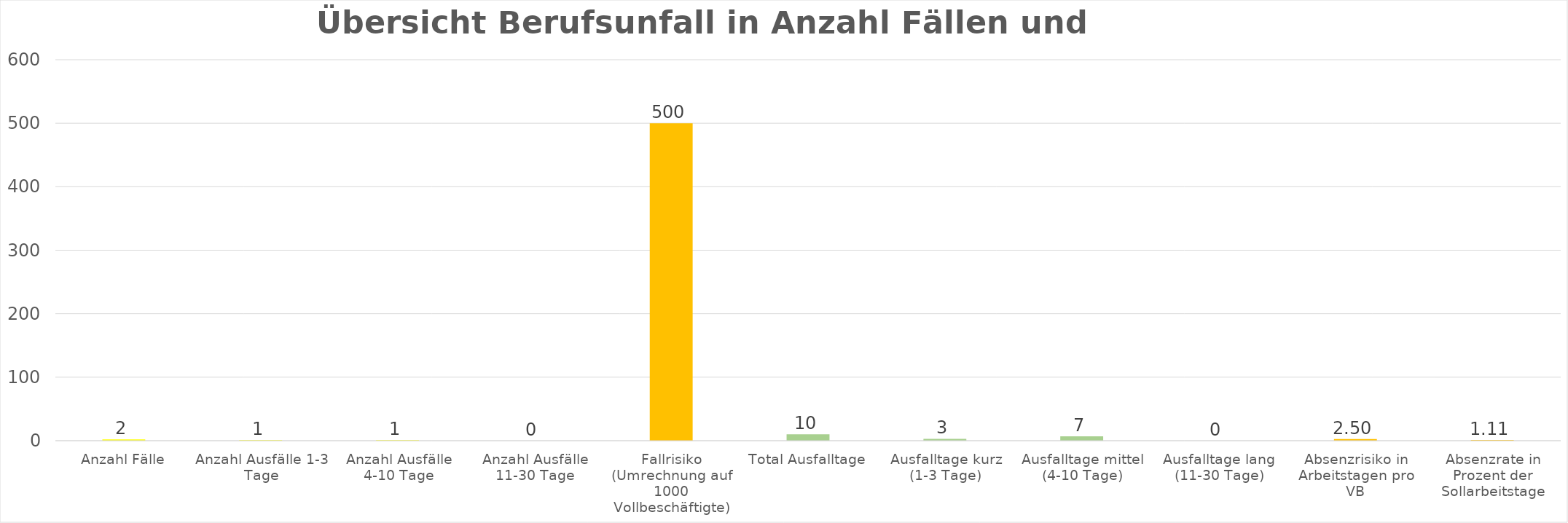
| Category | Berufsunfall |
|---|---|
| Anzahl Fälle | 2 |
| Anzahl Ausfälle 1-3 Tage | 1 |
| Anzahl Ausfälle 4-10 Tage | 1 |
| Anzahl Ausfälle 11-30 Tage | 0 |
| Fallrisiko (Umrechnung auf 1000 Vollbeschäftigte) | 500 |
| Total Ausfalltage | 10 |
| Ausfalltage kurz (1-3 Tage) | 3 |
| Ausfalltage mittel (4-10 Tage) | 7 |
| Ausfalltage lang (11-30 Tage) | 0 |
| Absenzrisiko in Arbeitstagen pro VB | 2.5 |
| Absenzrate in Prozent der Sollarbeitstage | 1.106 |